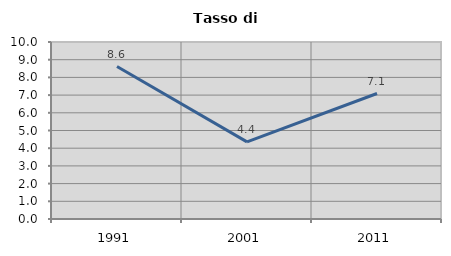
| Category | Tasso di disoccupazione   |
|---|---|
| 1991.0 | 8.616 |
| 2001.0 | 4.359 |
| 2011.0 | 7.089 |